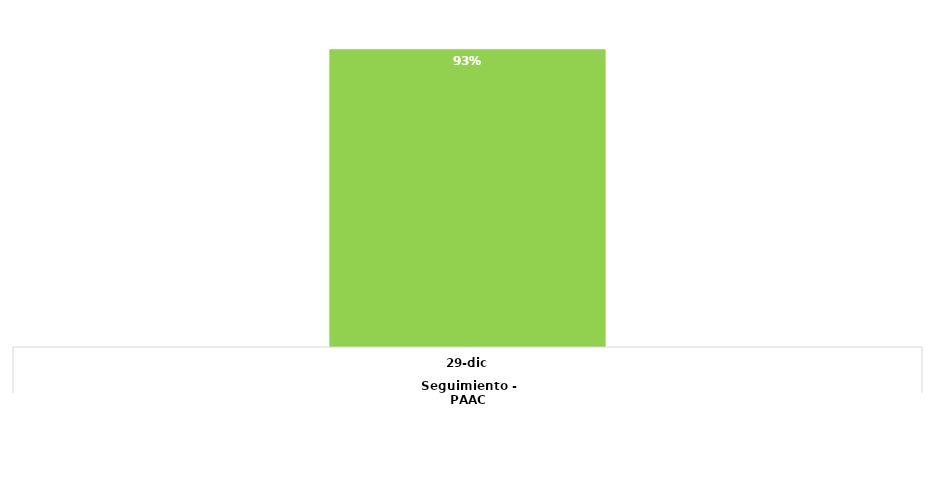
| Category | Total |
|---|---|
| 0 | 0.934 |